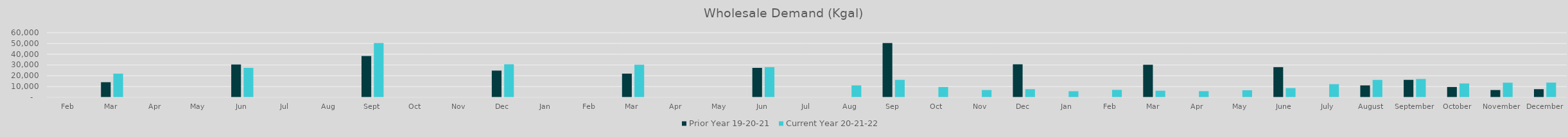
| Category | Prior Year 19-20-21 | Current Year 20-21-22 |
|---|---|---|
| Feb | 0 | 0 |
| Mar | 14013.78 | 21965.02 |
| Apr | 0 | 0 |
| May | 0 | 0 |
| Jun | 30443.6 | 27331 |
| Jul | 0 | 0 |
| Aug | 0 | 0 |
| Sep | 38376.14 | 50400.24 |
| Oct | 0 | 0 |
| Nov | 0 | 0 |
| Dec | 24784.98 | 30611.9 |
| Jan | 0 | 0 |
| Feb | 0 | 0 |
| Mar | 21965.02 | 30196.76 |
| Apr | 0 | 0 |
| May | 0 | 0 |
| Jun | 27331 | 27993.9 |
| Jul | 0 | 0 |
| Aug | 0 | 11056.179 |
| Sep | 50400.24 | 16202.763 |
| Oct | 0 | 9585.62 |
| Nov | 0 | 6754.44 |
| Dec | 30611.9 | 7547.32 |
| Jan | 0 | 5643.66 |
| Feb | 0 | 6907.78 |
| Mar | 30196.76 | 6111.16 |
| Apr | 0 | 5707.24 |
| May | 0 | 6522.56 |
| June | 27993.9 | 8549.64 |
| July | 0 | 12192.4 |
| August | 11056.179 | 16164.28 |
| September | 16202.763 | 17013.35 |
| October | 9585.62 | 12849.024 |
| November | 6754.44 | 13564.374 |
| December | 7547.32 | 13653.087 |